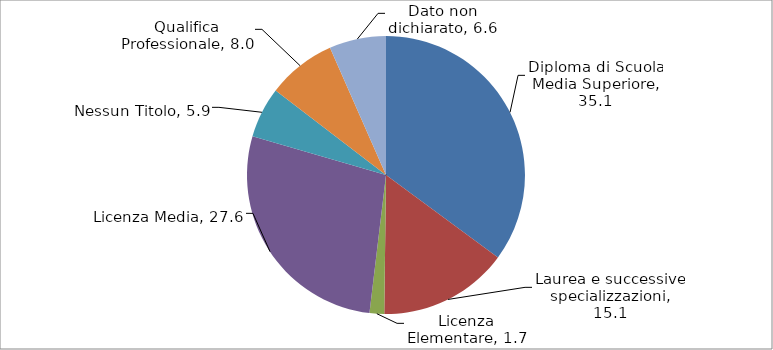
| Category | Series 0 |
|---|---|
| Diploma di Scuola Media Superiore | 35.1 |
| Laurea e successive specializzazioni | 15.1 |
| Licenza Elementare | 1.7 |
| Licenza Media | 27.6 |
| Nessun Titolo | 5.9 |
| Qualifica Professionale | 8 |
| Dato non dichiarato | 6.6 |